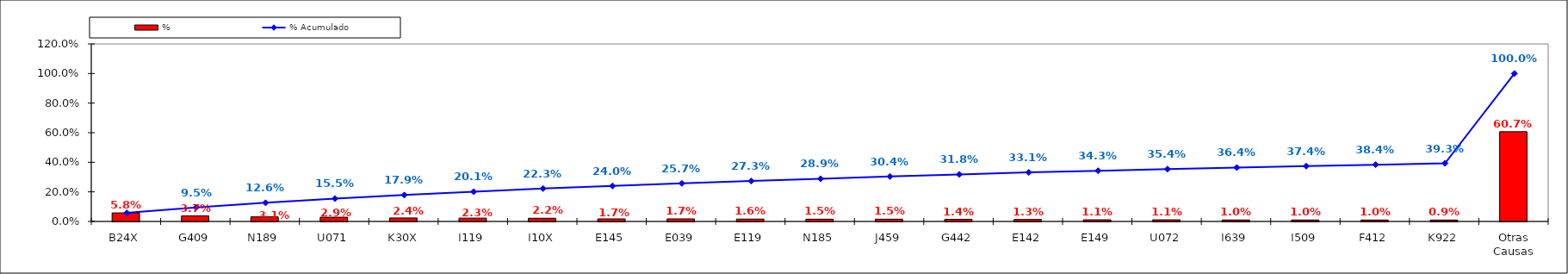
| Category | % |
|---|---|
| B24X | 0.058 |
| G409 | 0.037 |
| N189 | 0.031 |
| U071 | 0.029 |
| K30X | 0.024 |
| I119 | 0.023 |
| I10X | 0.022 |
| E145 | 0.017 |
| E039 | 0.017 |
| E119 | 0.016 |
| N185 | 0.015 |
| J459 | 0.015 |
| G442 | 0.014 |
| E142 | 0.013 |
| E149 | 0.011 |
| U072 | 0.011 |
| I639 | 0.01 |
| I509 | 0.01 |
| F412 | 0.01 |
| K922 | 0.009 |
| Otras Causas | 0.607 |